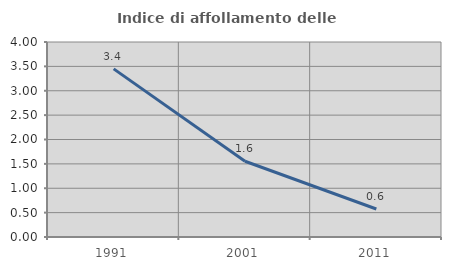
| Category | Indice di affollamento delle abitazioni  |
|---|---|
| 1991.0 | 3.448 |
| 2001.0 | 1.554 |
| 2011.0 | 0.575 |